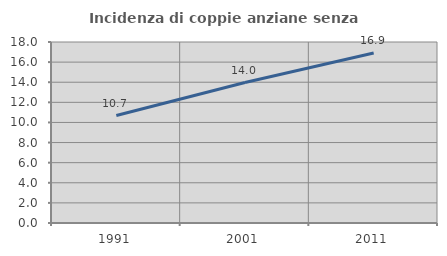
| Category | Incidenza di coppie anziane senza figli  |
|---|---|
| 1991.0 | 10.683 |
| 2001.0 | 13.97 |
| 2011.0 | 16.91 |